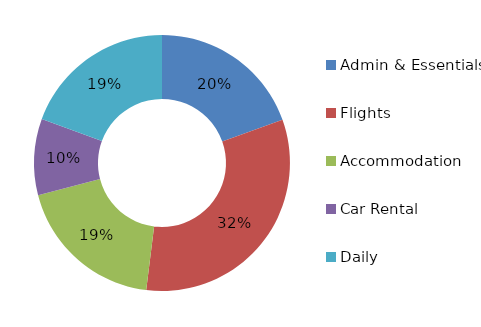
| Category | Series 0 |
|---|---|
| Admin & Essentials | 0.195 |
| Flights | 0.324 |
| Accommodation | 0.19 |
| Car Rental | 0.096 |
| Daily | 0.194 |